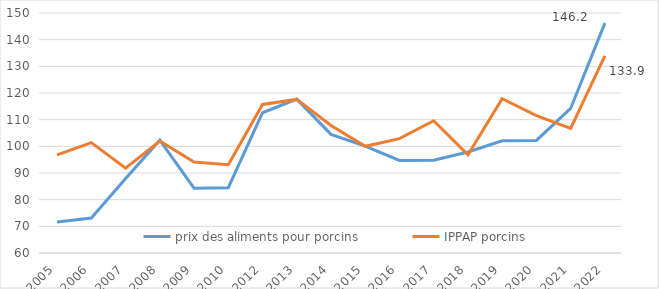
| Category | prix des aliments pour porcins | IPPAP porcins |
|---|---|---|
| 2005 | 71.6 | 96.8 |
| 2006 | 73.1 | 101.4 |
| 2007 | 87.9 | 91.8 |
| 2008 | 102.3 | 102 |
| 2009 | 84.3 | 94.1 |
| 2010 | 84.5 | 93.1 |
| 2012 | 112.6 | 115.7 |
| 2013 | 117.7 | 117.6 |
| 2014 | 104.5 | 107.8 |
| 2015 | 100.1 | 100 |
| 2016 | 94.7 | 102.9 |
| 2017 | 94.8 | 109.6 |
| 2018 | 97.9 | 96.8 |
| 2019 | 102.1 | 117.9 |
| 2020 | 102.2 | 111.5 |
| 2021 | 114.2 | 106.7 |
| 2022 | 146.2 | 133.9 |